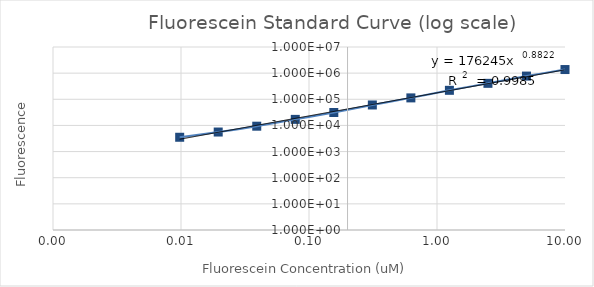
| Category | Series 1 |
|---|---|
| 10.0 | 1373260 |
| 5.0 | 771904.5 |
| 2.5 | 407455 |
| 1.25 | 220267.5 |
| 0.625 | 113072.75 |
| 0.3125 | 60584.95 |
| 0.15625 | 31197.725 |
| 0.078125 | 17044.325 |
| 0.0390625 | 9344.905 |
| 0.01953125 | 5591.162 |
| 0.009765625 | 3525.985 |